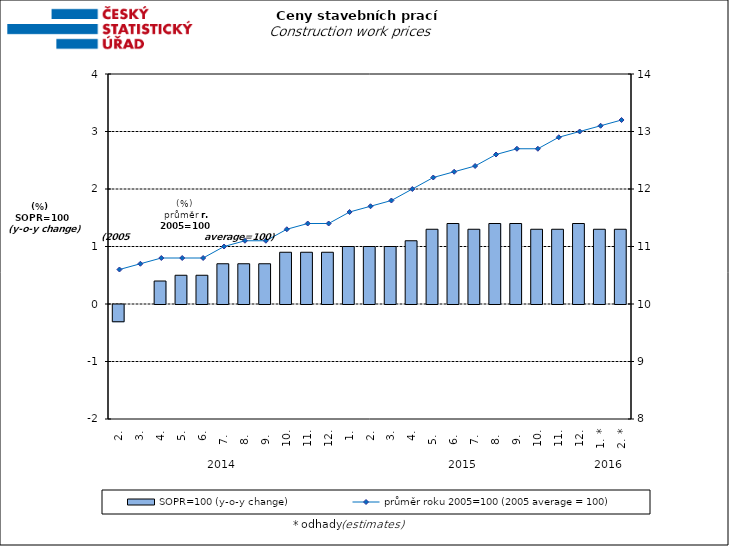
| Category | SOPR=100 (y-o-y change)   |
|---|---|
| 0 | -0.3 |
| 1 | 0 |
| 2 | 0.4 |
| 3 | 0.5 |
| 4 | 0.5 |
| 5 | 0.7 |
| 6 | 0.7 |
| 7 | 0.7 |
| 8 | 0.9 |
| 9 | 0.9 |
| 10 | 0.9 |
| 11 | 1 |
| 12 | 1 |
| 13 | 1 |
| 14 | 1.1 |
| 15 | 1.3 |
| 16 | 1.4 |
| 17 | 1.3 |
| 18 | 1.4 |
| 19 | 1.4 |
| 20 | 1.3 |
| 21 | 1.3 |
| 22 | 1.4 |
| 23 | 1.3 |
| 24 | 1.3 |